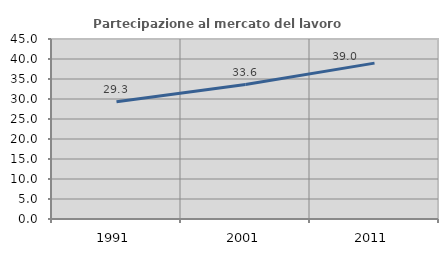
| Category | Partecipazione al mercato del lavoro  femminile |
|---|---|
| 1991.0 | 29.331 |
| 2001.0 | 33.613 |
| 2011.0 | 38.972 |